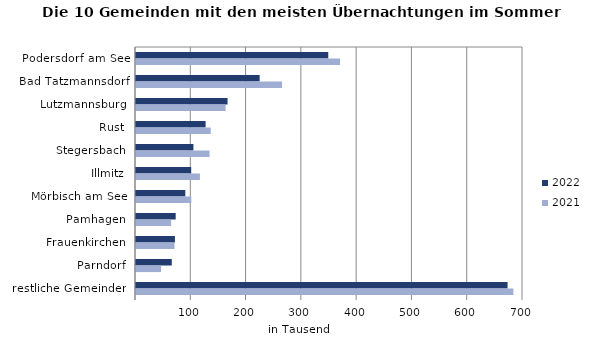
| Category | 2022 | 2021 |
|---|---|---|
| Podersdorf am See | 347748 | 369042 |
| Bad Tatzmannsdorf | 223688 | 264125 |
| Lutzmannsburg | 165595 | 162032 |
| Rust | 125917 | 135204 |
| Stegersbach | 103866 | 133057 |
| Illmitz | 99845 | 115665 |
| Mörbisch am See | 89175 | 100016 |
| Pamhagen | 71784 | 63530 |
| Frauenkirchen | 70387 | 69645 |
| Parndorf | 64705 | 45372 |
| restliche Gemeinden | 672067 | 682537 |